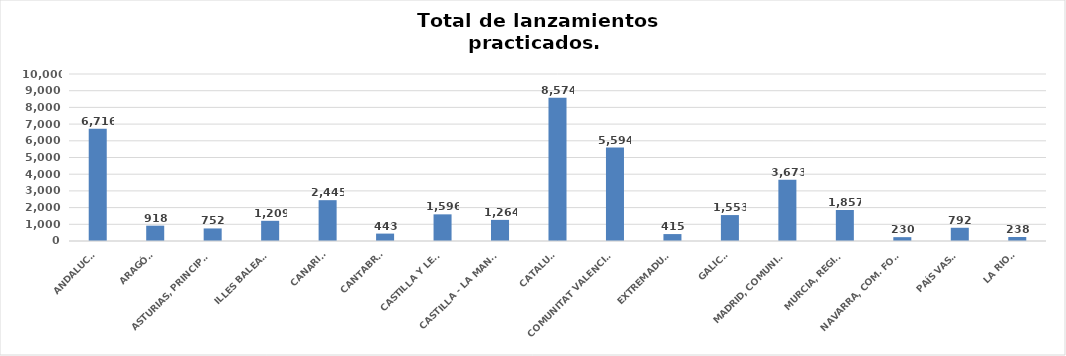
| Category | Series 0 |
|---|---|
| ANDALUCÍA | 6716 |
| ARAGÓN | 918 |
| ASTURIAS, PRINCIPADO | 752 |
| ILLES BALEARS | 1209 |
| CANARIAS | 2445 |
| CANTABRIA | 443 |
| CASTILLA Y LEÓN | 1596 |
| CASTILLA - LA MANCHA | 1264 |
| CATALUÑA | 8574 |
| COMUNITAT VALENCIANA | 5594 |
| EXTREMADURA | 415 |
| GALICIA | 1553 |
| MADRID, COMUNIDAD | 3673 |
| MURCIA, REGIÓN | 1857 |
| NAVARRA, COM. FORAL | 230 |
| PAÍS VASCO | 792 |
| LA RIOJA | 238 |